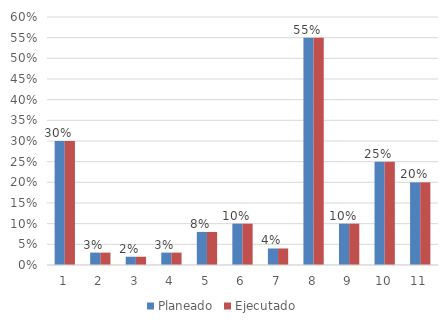
| Category | Planeado  | Ejecutado |
|---|---|---|
| 1.0 | 0.3 | 0.3 |
| 2.0 | 0.03 | 0.03 |
| 3.0 | 0.02 | 0.02 |
| 4.0 | 0.03 | 0.03 |
| 5.0 | 0.08 | 0.08 |
| 6.0 | 0.1 | 0.1 |
| 7.0 | 0.04 | 0.04 |
| 8.0 | 0.55 | 0.55 |
| 9.0 | 0.1 | 0.1 |
| 10.0 | 0.25 | 0.25 |
| 11.0 | 0.2 | 0.2 |